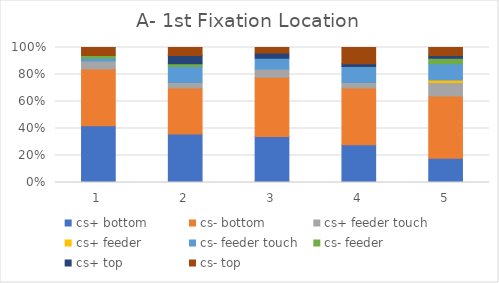
| Category | cs+ bottom | cs- bottom | cs+ feeder touch | cs+ feeder | cs- feeder touch | cs- feeder | cs+ top | cs- top |
|---|---|---|---|---|---|---|---|---|
| 0 | 21 | 21 | 3 | 0 | 1 | 1 | 0 | 3 |
| 1 | 18 | 17 | 2 | 0 | 6 | 1 | 3 | 3 |
| 2 | 17 | 22 | 3 | 0 | 4 | 0 | 2 | 2 |
| 3 | 14 | 21 | 2 | 0 | 6 | 0 | 1 | 6 |
| 4 | 9 | 23 | 5 | 1 | 6 | 2 | 1 | 3 |